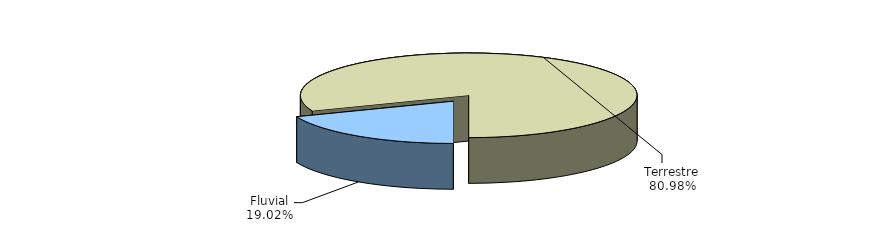
| Category | Series 0 |
|---|---|
| Fluvial | 19.018 |
| Terrestre | 80.982 |